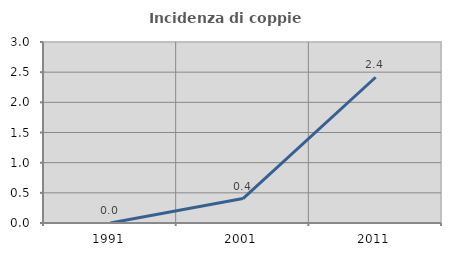
| Category | Incidenza di coppie miste |
|---|---|
| 1991.0 | 0 |
| 2001.0 | 0.405 |
| 2011.0 | 2.415 |